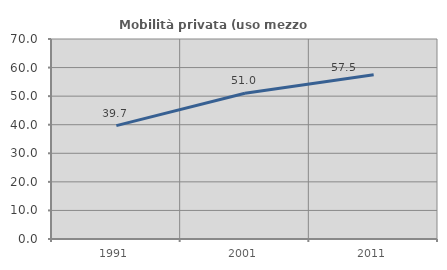
| Category | Mobilità privata (uso mezzo privato) |
|---|---|
| 1991.0 | 39.676 |
| 2001.0 | 50.99 |
| 2011.0 | 57.471 |